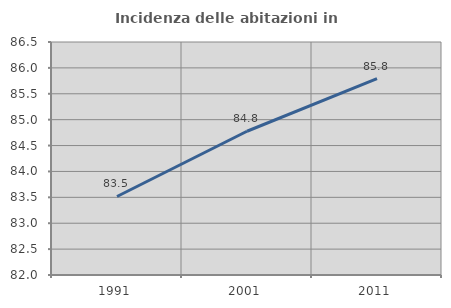
| Category | Incidenza delle abitazioni in proprietà  |
|---|---|
| 1991.0 | 83.516 |
| 2001.0 | 84.777 |
| 2011.0 | 85.794 |